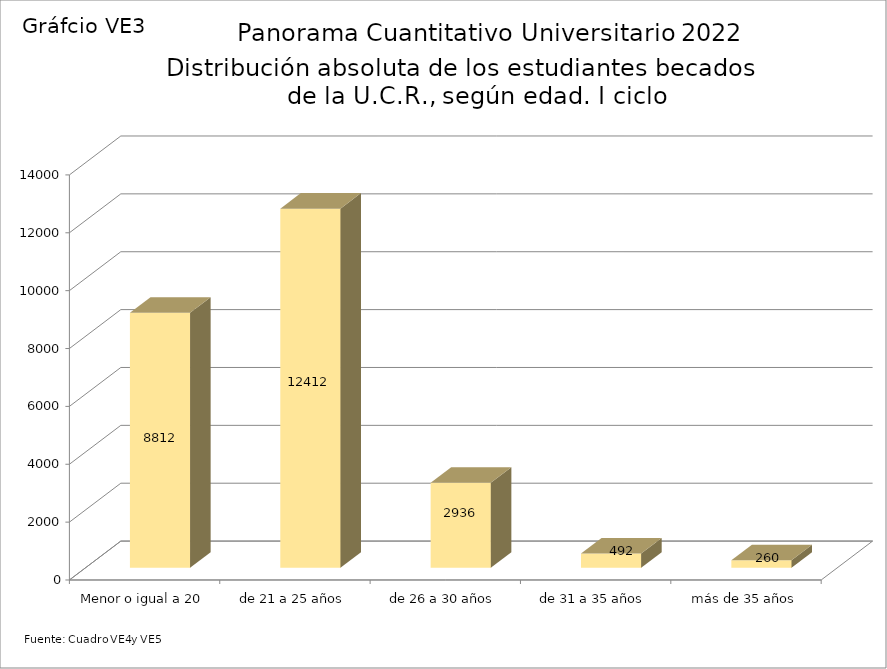
| Category | Series 0 |
|---|---|
| Menor o igual a 20 | 8812 |
| de 21 a 25 años | 12412 |
| de 26 a 30 años | 2936 |
| de 31 a 35 años | 492 |
| más de 35 años | 260 |